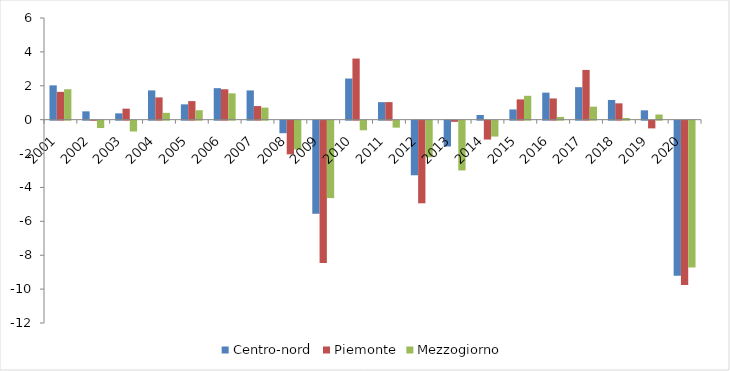
| Category | Centro-nord | Piemonte | Mezzogiorno |
|---|---|---|---|
| 2001 | 2.025 | 1.642 | 1.796 |
| 2002 | 0.492 | -0.008 | -0.435 |
| 2003 | 0.373 | 0.651 | -0.639 |
| 2004 | 1.727 | 1.314 | 0.401 |
| 2005 | 0.904 | 1.097 | 0.555 |
| 2006 | 1.859 | 1.795 | 1.555 |
| 2007 | 1.727 | 0.802 | 0.712 |
| 2008 | -0.739 | -1.989 | -1.701 |
| 2009 | -5.495 | -8.406 | -4.569 |
| 2010 | 2.428 | 3.607 | -0.567 |
| 2011 | 1.034 | 1.037 | -0.412 |
| 2012 | -3.222 | -4.877 | -2.159 |
| 2013 | -1.523 | -0.07 | -2.938 |
| 2014 | 0.276 | -1.115 | -0.939 |
| 2015 | 0.603 | 1.196 | 1.409 |
| 2016 | 1.595 | 1.254 | 0.161 |
| 2017 | 1.917 | 2.935 | 0.767 |
| 2018 | 1.163 | 0.964 | 0.101 |
| 2019 | 0.55 | -0.455 | 0.304 |
| 2020 | -9.158 | -9.705 | -8.659 |